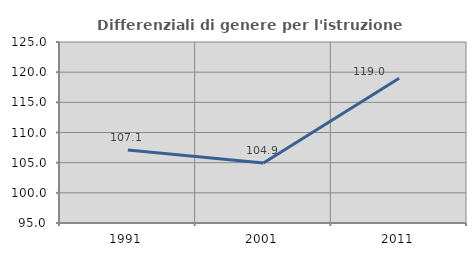
| Category | Differenziali di genere per l'istruzione superiore |
|---|---|
| 1991.0 | 107.1 |
| 2001.0 | 104.935 |
| 2011.0 | 118.985 |